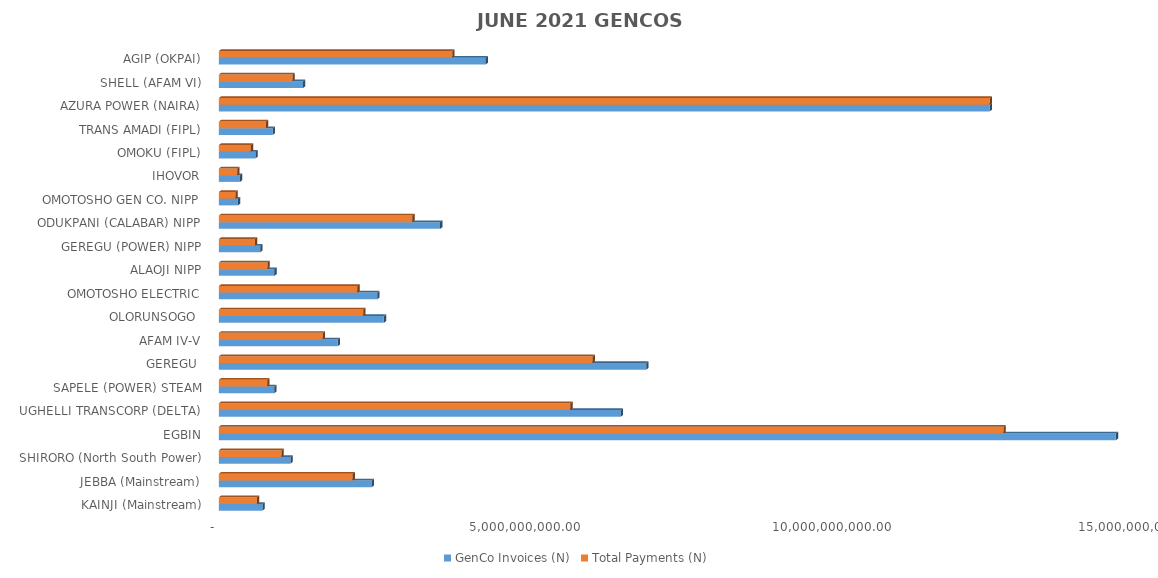
| Category | GenCo Invoices (N) | Total Payments (N) |
|---|---|---|
| KAINJI (Mainstream) | 709983576.53 | 620957768.244 |
| JEBBA (Mainstream) | 2491843522.01 | 2179387866.693 |
| SHIRORO (North South Power) | 1165702165.13 | 1019533181.928 |
| EGBIN | 14617706996.93 | 12784772794.354 |
| UGHELLI TRANSCORP (DELTA) | 6549539538.25 | 5728283849.29 |
| SAPELE (POWER) STEAM | 902493684.64 | 789328771.529 |
| GEREGU  | 6963756586.06 | 6090561656.945 |
| AFAM IV-V | 1935524246.56 | 1692826223.39 |
| OLORUNSOGO  | 2689636676.41 | 2352379467.894 |
| OMOTOSHO ELECTRIC | 2580593512.54 | 2257009374.954 |
| ALAOJI NIPP | 904753857.99 | 791305538.663 |
| GEREGU (POWER) NIPP | 672969989.85 | 588585365.643 |
| ODUKPANI (CALABAR) NIPP | 3605125757.2 | 3153074125.138 |
| OMOTOSHO GEN CO. NIPP | 311342296.83 | 272302661.907 |
| IHOVOR | 343959408.37 | 300829869.378 |
| OMOKU (FIPL) | 596024473.54 | 521288152.491 |
| TRANS AMADI (FIPL) | 877345476.91 | 767333931.841 |
| AZURA POWER (NAIRA) | 12560680730.207 | 12560680730.205 |
| SHELL (AFAM VI) | 1372018347.226 | 1199979096.766 |
| AGIP (OKPAI) | 4346912397.054 | 3801847127.253 |